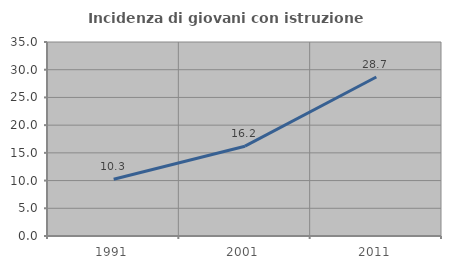
| Category | Incidenza di giovani con istruzione universitaria |
|---|---|
| 1991.0 | 10.251 |
| 2001.0 | 16.203 |
| 2011.0 | 28.691 |